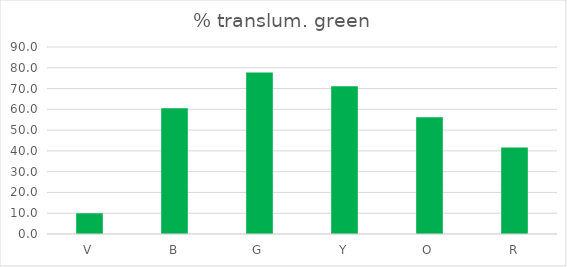
| Category | % translum. |
|---|---|
| V | 9.97 |
| B | 60.553 |
| G | 77.71 |
| Y | 71.08 |
| O | 56.189 |
| R | 41.669 |